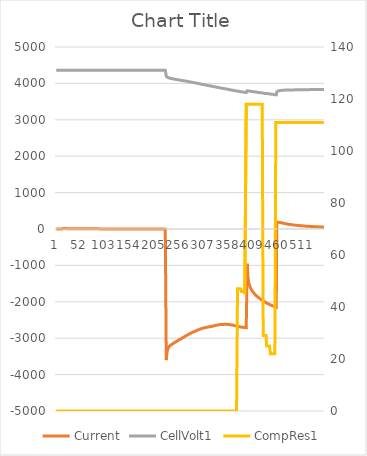
| Category | Current | CellVolt1 |
|---|---|---|
| 0 | 0 | 4359 |
| 1 | 0 | 4360 |
| 2 | 0 | 4359 |
| 3 | 0 | 4359 |
| 4 | 0 | 4359 |
| 5 | 0 | 4359 |
| 6 | 0 | 4360 |
| 7 | 0 | 4360 |
| 8 | 0 | 4359 |
| 9 | 0 | 4360 |
| 10 | 0 | 4361 |
| 11 | 0 | 4359 |
| 12 | 0 | 4359 |
| 13 | 0 | 4359 |
| 14 | 5 | 4361 |
| 15 | 15 | 4360 |
| 16 | 13 | 4360 |
| 17 | 11 | 4360 |
| 18 | 11 | 4360 |
| 19 | 12 | 4361 |
| 20 | 11 | 4360 |
| 21 | 10 | 4360 |
| 22 | 11 | 4360 |
| 23 | 10 | 4361 |
| 24 | 9 | 4360 |
| 25 | 9 | 4360 |
| 26 | 9 | 4360 |
| 27 | 7 | 4360 |
| 28 | 7 | 4360 |
| 29 | 7 | 4360 |
| 30 | 9 | 4360 |
| 31 | 8 | 4360 |
| 32 | 9 | 4360 |
| 33 | 9 | 4360 |
| 34 | 8 | 4360 |
| 35 | 8 | 4360 |
| 36 | 8 | 4360 |
| 37 | 6 | 4360 |
| 38 | 7 | 4360 |
| 39 | 8 | 4361 |
| 40 | 8 | 4360 |
| 41 | 8 | 4360 |
| 42 | 7 | 4359 |
| 43 | 8 | 4360 |
| 44 | 7 | 4360 |
| 45 | 7 | 4360 |
| 46 | 7 | 4360 |
| 47 | 8 | 4361 |
| 48 | 7 | 4360 |
| 49 | 6 | 4360 |
| 50 | 7 | 4360 |
| 51 | 8 | 4360 |
| 52 | 7 | 4360 |
| 53 | 7 | 4360 |
| 54 | 7 | 4360 |
| 55 | 6 | 4359 |
| 56 | 6 | 4361 |
| 57 | 8 | 4360 |
| 58 | 7 | 4360 |
| 59 | 6 | 4360 |
| 60 | 5 | 4360 |
| 61 | 6 | 4360 |
| 62 | 6 | 4361 |
| 63 | 6 | 4360 |
| 64 | 6 | 4360 |
| 65 | 5 | 4360 |
| 66 | 7 | 4360 |
| 67 | 5 | 4360 |
| 68 | 5 | 4360 |
| 69 | 4 | 4360 |
| 70 | 6 | 4360 |
| 71 | 7 | 4360 |
| 72 | 6 | 4360 |
| 73 | 5 | 4360 |
| 74 | 5 | 4360 |
| 75 | 4 | 4360 |
| 76 | 4 | 4359 |
| 77 | 4 | 4360 |
| 78 | 6 | 4360 |
| 79 | 5 | 4360 |
| 80 | 5 | 4362 |
| 81 | 5 | 4361 |
| 82 | 4 | 4363 |
| 83 | 5 | 4363 |
| 84 | 7 | 4364 |
| 85 | 6 | 4364 |
| 86 | 5 | 4364 |
| 87 | 6 | 4363 |
| 88 | 0 | 4362 |
| 89 | 0 | 4362 |
| 90 | 0 | 4361 |
| 91 | 0 | 4361 |
| 92 | 0 | 4360 |
| 93 | 0 | 4361 |
| 94 | 0 | 4361 |
| 95 | 0 | 4361 |
| 96 | 0 | 4359 |
| 97 | 0 | 4362 |
| 98 | 0 | 4359 |
| 99 | 0 | 4360 |
| 100 | 0 | 4359 |
| 101 | 0 | 4360 |
| 102 | 0 | 4361 |
| 103 | 0 | 4361 |
| 104 | 0 | 4360 |
| 105 | 0 | 4360 |
| 106 | 0 | 4361 |
| 107 | 0 | 4361 |
| 108 | 0 | 4359 |
| 109 | 0 | 4360 |
| 110 | 0 | 4360 |
| 111 | 0 | 4361 |
| 112 | 0 | 4359 |
| 113 | 0 | 4359 |
| 114 | 0 | 4360 |
| 115 | 0 | 4360 |
| 116 | 0 | 4360 |
| 117 | 0 | 4360 |
| 118 | 0 | 4360 |
| 119 | 0 | 4360 |
| 120 | 0 | 4360 |
| 121 | 0 | 4360 |
| 122 | 0 | 4359 |
| 123 | 0 | 4360 |
| 124 | 0 | 4360 |
| 125 | 0 | 4360 |
| 126 | 0 | 4359 |
| 127 | 0 | 4360 |
| 128 | 0 | 4359 |
| 129 | 0 | 4359 |
| 130 | 0 | 4359 |
| 131 | 0 | 4360 |
| 132 | 0 | 4360 |
| 133 | 0 | 4359 |
| 134 | 0 | 4359 |
| 135 | 0 | 4359 |
| 136 | 0 | 4360 |
| 137 | 0 | 4359 |
| 138 | 0 | 4359 |
| 139 | 0 | 4359 |
| 140 | 0 | 4359 |
| 141 | 0 | 4359 |
| 142 | 0 | 4359 |
| 143 | 0 | 4358 |
| 144 | 0 | 4359 |
| 145 | 0 | 4358 |
| 146 | 0 | 4360 |
| 147 | 0 | 4360 |
| 148 | 0 | 4359 |
| 149 | 0 | 4358 |
| 150 | 0 | 4359 |
| 151 | 0 | 4358 |
| 152 | 0 | 4359 |
| 153 | 0 | 4358 |
| 154 | 0 | 4358 |
| 155 | 0 | 4359 |
| 156 | 0 | 4359 |
| 157 | 0 | 4360 |
| 158 | 0 | 4360 |
| 159 | 0 | 4358 |
| 160 | 0 | 4358 |
| 161 | 0 | 4358 |
| 162 | 0 | 4359 |
| 163 | 0 | 4358 |
| 164 | 0 | 4358 |
| 165 | 0 | 4360 |
| 166 | 0 | 4358 |
| 167 | 0 | 4358 |
| 168 | 0 | 4358 |
| 169 | 0 | 4358 |
| 170 | 0 | 4358 |
| 171 | 0 | 4359 |
| 172 | 0 | 4359 |
| 173 | 0 | 4359 |
| 174 | 0 | 4358 |
| 175 | 0 | 4359 |
| 176 | 0 | 4358 |
| 177 | 0 | 4358 |
| 178 | 0 | 4358 |
| 179 | 0 | 4358 |
| 180 | 0 | 4359 |
| 181 | 0 | 4358 |
| 182 | 0 | 4358 |
| 183 | 0 | 4358 |
| 184 | 0 | 4359 |
| 185 | 0 | 4359 |
| 186 | 0 | 4358 |
| 187 | 0 | 4358 |
| 188 | 0 | 4359 |
| 189 | 0 | 4359 |
| 190 | 0 | 4358 |
| 191 | 0 | 4358 |
| 192 | 0 | 4359 |
| 193 | 0 | 4358 |
| 194 | 0 | 4358 |
| 195 | 0 | 4358 |
| 196 | 0 | 4358 |
| 197 | 0 | 4358 |
| 198 | 0 | 4358 |
| 199 | 0 | 4358 |
| 200 | 0 | 4358 |
| 201 | 0 | 4359 |
| 202 | 0 | 4359 |
| 203 | 0 | 4358 |
| 204 | 0 | 4358 |
| 205 | 0 | 4358 |
| 206 | 0 | 4358 |
| 207 | 0 | 4359 |
| 208 | 0 | 4358 |
| 209 | 0 | 4358 |
| 210 | 0 | 4360 |
| 211 | 0 | 4358 |
| 212 | 0 | 4359 |
| 213 | 0 | 4358 |
| 214 | 0 | 4358 |
| 215 | 0 | 4358 |
| 216 | 0 | 4360 |
| 217 | 0 | 4359 |
| 218 | 0 | 4358 |
| 219 | 0 | 4359 |
| 220 | 0 | 4358 |
| 221 | 0 | 4358 |
| 222 | 0 | 4358 |
| 223 | 0 | 4359 |
| 224 | -6 | 4359 |
| 225 | -5 | 4358 |
| 226 | -5 | 4358 |
| 227 | -3602 | 4196 |
| 228 | -3444 | 4182 |
| 229 | -3359 | 4172 |
| 230 | -3307 | 4164 |
| 231 | -3273 | 4158 |
| 232 | -3249 | 4153 |
| 233 | -3230 | 4149 |
| 234 | -3216 | 4144 |
| 235 | -3203 | 4141 |
| 236 | -3192 | 4138 |
| 237 | -3181 | 4135 |
| 238 | -3172 | 4132 |
| 239 | -3164 | 4129 |
| 240 | -3156 | 4127 |
| 241 | -3148 | 4125 |
| 242 | -3138 | 4122 |
| 243 | -3130 | 4119 |
| 244 | -3122 | 4117 |
| 245 | -3115 | 4114 |
| 246 | -3105 | 4112 |
| 247 | -3097 | 4110 |
| 248 | -3090 | 4107 |
| 249 | -3082 | 4105 |
| 250 | -3074 | 4103 |
| 251 | -3066 | 4100 |
| 252 | -3059 | 4098 |
| 253 | -3051 | 4095 |
| 254 | -3040 | 4093 |
| 255 | -3035 | 4090 |
| 256 | -3026 | 4088 |
| 257 | -3019 | 4085 |
| 258 | -3010 | 4083 |
| 259 | -3001 | 4080 |
| 260 | -2993 | 4078 |
| 261 | -2987 | 4077 |
| 262 | -2978 | 4073 |
| 263 | -2971 | 4074 |
| 264 | -2963 | 4068 |
| 265 | -2955 | 4066 |
| 266 | -2947 | 4066 |
| 267 | -2939 | 4064 |
| 268 | -2932 | 4061 |
| 269 | -2924 | 4059 |
| 270 | -2916 | 4057 |
| 271 | -2909 | 4054 |
| 272 | -2902 | 4051 |
| 273 | -2895 | 4048 |
| 274 | -2887 | 4047 |
| 275 | -2880 | 4043 |
| 276 | -2874 | 4041 |
| 277 | -2868 | 4039 |
| 278 | -2860 | 4036 |
| 279 | -2852 | 4033 |
| 280 | -2845 | 4031 |
| 281 | -2839 | 4028 |
| 282 | -2835 | 4026 |
| 283 | -2826 | 4023 |
| 284 | -2821 | 4021 |
| 285 | -2815 | 4018 |
| 286 | -2809 | 4015 |
| 287 | -2803 | 4013 |
| 288 | -2797 | 4010 |
| 289 | -2791 | 4007 |
| 290 | -2786 | 4005 |
| 291 | -2780 | 4002 |
| 292 | -2774 | 4000 |
| 293 | -2769 | 3997 |
| 294 | -2764 | 3994 |
| 295 | -2759 | 3992 |
| 296 | -2753 | 3989 |
| 297 | -2750 | 3986 |
| 298 | -2746 | 3984 |
| 299 | -2740 | 3981 |
| 300 | -2735 | 3978 |
| 301 | -2731 | 3976 |
| 302 | -2727 | 3973 |
| 303 | -2724 | 3971 |
| 304 | -2720 | 3968 |
| 305 | -2717 | 3965 |
| 306 | -2712 | 3962 |
| 307 | -2711 | 3961 |
| 308 | -2706 | 3957 |
| 309 | -2703 | 3955 |
| 310 | -2701 | 3952 |
| 311 | -2699 | 3948 |
| 312 | -2696 | 3946 |
| 313 | -2693 | 3943 |
| 314 | -2691 | 3940 |
| 315 | -2689 | 3939 |
| 316 | -2685 | 3936 |
| 317 | -2684 | 3933 |
| 318 | -2680 | 3930 |
| 319 | -2678 | 3927 |
| 320 | -2676 | 3925 |
| 321 | -2673 | 3922 |
| 322 | -2670 | 3920 |
| 323 | -2667 | 3917 |
| 324 | -2664 | 3914 |
| 325 | -2662 | 3912 |
| 326 | -2659 | 3909 |
| 327 | -2654 | 3906 |
| 328 | -2650 | 3904 |
| 329 | -2647 | 3901 |
| 330 | -2645 | 3898 |
| 331 | -2642 | 3896 |
| 332 | -2639 | 3893 |
| 333 | -2638 | 3891 |
| 334 | -2636 | 3888 |
| 335 | -2632 | 3885 |
| 336 | -2629 | 3883 |
| 337 | -2629 | 3880 |
| 338 | -2627 | 3877 |
| 339 | -2627 | 3875 |
| 340 | -2626 | 3872 |
| 341 | -2626 | 3870 |
| 342 | -2624 | 3868 |
| 343 | -2623 | 3865 |
| 344 | -2623 | 3862 |
| 345 | -2621 | 3860 |
| 346 | -2620 | 3857 |
| 347 | -2619 | 3855 |
| 348 | -2621 | 3853 |
| 349 | -2620 | 3850 |
| 350 | -2619 | 3848 |
| 351 | -2619 | 3845 |
| 352 | -2623 | 3842 |
| 353 | -2622 | 3840 |
| 354 | -2621 | 3838 |
| 355 | -2622 | 3836 |
| 356 | -2623 | 3833 |
| 357 | -2625 | 3830 |
| 358 | -2626 | 3828 |
| 359 | -2629 | 3824 |
| 360 | -2629 | 3822 |
| 361 | -2632 | 3819 |
| 362 | -2635 | 3817 |
| 363 | -2637 | 3815 |
| 364 | -2641 | 3812 |
| 365 | -2643 | 3810 |
| 366 | -2648 | 3807 |
| 367 | -2650 | 3804 |
| 368 | -2654 | 3802 |
| 369 | -2657 | 3800 |
| 370 | -2661 | 3798 |
| 371 | -2663 | 3795 |
| 372 | -2668 | 3792 |
| 373 | -2672 | 3790 |
| 374 | -2674 | 3788 |
| 375 | -2677 | 3785 |
| 376 | -2681 | 3783 |
| 377 | -2683 | 3781 |
| 378 | -2686 | 3778 |
| 379 | -2687 | 3776 |
| 380 | -2690 | 3773 |
| 381 | -2694 | 3771 |
| 382 | -2695 | 3769 |
| 383 | -2697 | 3767 |
| 384 | -2699 | 3764 |
| 385 | -2702 | 3762 |
| 386 | -2702 | 3760 |
| 387 | -2704 | 3758 |
| 388 | -2705 | 3756 |
| 389 | -2708 | 3754 |
| 390 | -2713 | 3751 |
| 391 | -2711 | 3749 |
| 392 | -2712 | 3750 |
| 393 | -2713 | 3745 |
| 394 | -955 | 3798 |
| 395 | -1230 | 3796 |
| 396 | -1371 | 3794 |
| 397 | -1460 | 3792 |
| 398 | -1519 | 3790 |
| 399 | -1563 | 3788 |
| 400 | -1599 | 3786 |
| 401 | -1627 | 3784 |
| 402 | -1654 | 3782 |
| 403 | -1677 | 3781 |
| 404 | -1696 | 3778 |
| 405 | -1714 | 3776 |
| 406 | -1731 | 3774 |
| 407 | -1748 | 3772 |
| 408 | -1765 | 3769 |
| 409 | -1781 | 3768 |
| 410 | -1795 | 3765 |
| 411 | -1808 | 3763 |
| 412 | -1823 | 3762 |
| 413 | -1833 | 3759 |
| 414 | -1845 | 3757 |
| 415 | -1857 | 3755 |
| 416 | -1869 | 3753 |
| 417 | -1880 | 3751 |
| 418 | -1890 | 3749 |
| 419 | -1901 | 3747 |
| 420 | -1911 | 3745 |
| 421 | -1921 | 3744 |
| 422 | -1930 | 3742 |
| 423 | -1941 | 3740 |
| 424 | -1949 | 3742 |
| 425 | -1956 | 3736 |
| 426 | -1966 | 3734 |
| 427 | -1975 | 3732 |
| 428 | -1983 | 3730 |
| 429 | -1990 | 3728 |
| 430 | -1999 | 3726 |
| 431 | -2007 | 3724 |
| 432 | -2014 | 3726 |
| 433 | -2024 | 3724 |
| 434 | -2031 | 3723 |
| 435 | -2039 | 3720 |
| 436 | -2047 | 3718 |
| 437 | -2053 | 3717 |
| 438 | -2059 | 3715 |
| 439 | -2065 | 3713 |
| 440 | -2072 | 3711 |
| 441 | -2079 | 3710 |
| 442 | -2087 | 3708 |
| 443 | -2096 | 3705 |
| 444 | -2097 | 3704 |
| 445 | -2103 | 3702 |
| 446 | -2108 | 3700 |
| 447 | -2113 | 3699 |
| 448 | -2119 | 3697 |
| 449 | -2126 | 3696 |
| 450 | -2130 | 3695 |
| 451 | -2135 | 3689 |
| 452 | -2139 | 3691 |
| 453 | -2145 | 3690 |
| 454 | -2150 | 3686 |
| 455 | 158 | 3766 |
| 456 | 184 | 3779 |
| 457 | 188 | 3786 |
| 458 | 189 | 3792 |
| 459 | 187 | 3797 |
| 460 | 182 | 3800 |
| 461 | 181 | 3803 |
| 462 | 177 | 3805 |
| 463 | 175 | 3807 |
| 464 | 171 | 3808 |
| 465 | 168 | 3810 |
| 466 | 166 | 3812 |
| 467 | 164 | 3812 |
| 468 | 159 | 3813 |
| 469 | 156 | 3814 |
| 470 | 153 | 3815 |
| 471 | 151 | 3816 |
| 472 | 149 | 3815 |
| 473 | 146 | 3817 |
| 474 | 143 | 3818 |
| 475 | 140 | 3818 |
| 476 | 137 | 3819 |
| 477 | 137 | 3818 |
| 478 | 134 | 3819 |
| 479 | 131 | 3819 |
| 480 | 128 | 3820 |
| 481 | 126 | 3819 |
| 482 | 124 | 3819 |
| 483 | 122 | 3820 |
| 484 | 121 | 3820 |
| 485 | 120 | 3821 |
| 486 | 118 | 3821 |
| 487 | 115 | 3821 |
| 488 | 114 | 3822 |
| 489 | 112 | 3822 |
| 490 | 110 | 3822 |
| 491 | 110 | 3822 |
| 492 | 107 | 3823 |
| 493 | 105 | 3823 |
| 494 | 103 | 3823 |
| 495 | 102 | 3823 |
| 496 | 100 | 3824 |
| 497 | 99 | 3824 |
| 498 | 97 | 3824 |
| 499 | 96 | 3824 |
| 500 | 95 | 3825 |
| 501 | 92 | 3825 |
| 502 | 92 | 3825 |
| 503 | 91 | 3825 |
| 504 | 90 | 3825 |
| 505 | 88 | 3826 |
| 506 | 87 | 3825 |
| 507 | 88 | 3825 |
| 508 | 87 | 3826 |
| 509 | 85 | 3826 |
| 510 | 83 | 3826 |
| 511 | 83 | 3826 |
| 512 | 83 | 3826 |
| 513 | 82 | 3826 |
| 514 | 79 | 3826 |
| 515 | 77 | 3827 |
| 516 | 76 | 3827 |
| 517 | 76 | 3827 |
| 518 | 75 | 3827 |
| 519 | 75 | 3827 |
| 520 | 74 | 3827 |
| 521 | 74 | 3827 |
| 522 | 73 | 3831 |
| 523 | 71 | 3831 |
| 524 | 70 | 3831 |
| 525 | 69 | 3831 |
| 526 | 70 | 3832 |
| 527 | 69 | 3831 |
| 528 | 67 | 3832 |
| 529 | 67 | 3831 |
| 530 | 66 | 3831 |
| 531 | 66 | 3832 |
| 532 | 64 | 3832 |
| 533 | 63 | 3832 |
| 534 | 64 | 3832 |
| 535 | 63 | 3832 |
| 536 | 62 | 3832 |
| 537 | 61 | 3832 |
| 538 | 62 | 3832 |
| 539 | 60 | 3832 |
| 540 | 61 | 3832 |
| 541 | 60 | 3832 |
| 542 | 60 | 3833 |
| 543 | 58 | 3833 |
| 544 | 57 | 3832 |
| 545 | 57 | 3832 |
| 546 | 56 | 3832 |
| 547 | 55 | 3833 |
| 548 | 55 | 3832 |
| 549 | 55 | 3833 |
| 550 | 54 | 3831 |
| 551 | 55 | 3831 |
| 552 | 53 | 3831 |
| 553 | 54 | 3831 |
| 554 | 53 | 3831 |